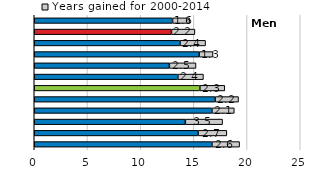
| Category | 2000 | Years gained for 2000-2014 |
|---|---|---|
| HUN | 13 | 1.6 |
| SVK | 12.9 | 2.2 |
| CZE | 13.7 | 2.4 |
| CHL | 15.5 | 1.3 |
| POL | 12.7 | 2.5 |
| EST | 13.5 | 2.4 |
| OECD | 15.568 | 2.341 |
| ISR | 17 | 2.2 |
| SVN | 16.7 | 2.1 |
| GRC | 14.2 | 3.5 |
| PRT | 15.4 | 2.7 |
| ESP | 16.7 | 2.6 |